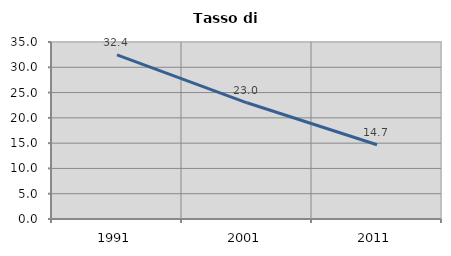
| Category | Tasso di disoccupazione   |
|---|---|
| 1991.0 | 32.45 |
| 2001.0 | 22.979 |
| 2011.0 | 14.691 |